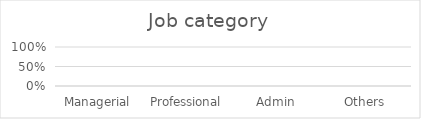
| Category | Series 0 |
|---|---|
| Managerial | 0 |
| Professional | 0 |
| Admin | 0 |
| Others | 0 |